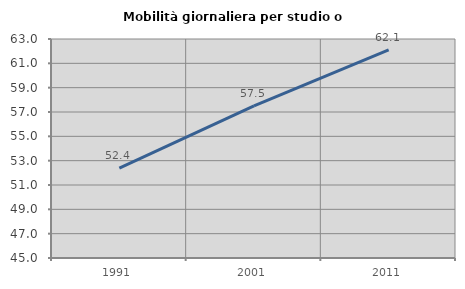
| Category | Mobilità giornaliera per studio o lavoro |
|---|---|
| 1991.0 | 52.383 |
| 2001.0 | 57.508 |
| 2011.0 | 62.097 |